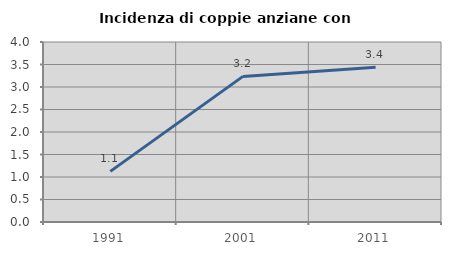
| Category | Incidenza di coppie anziane con figli |
|---|---|
| 1991.0 | 1.125 |
| 2001.0 | 3.236 |
| 2011.0 | 3.438 |